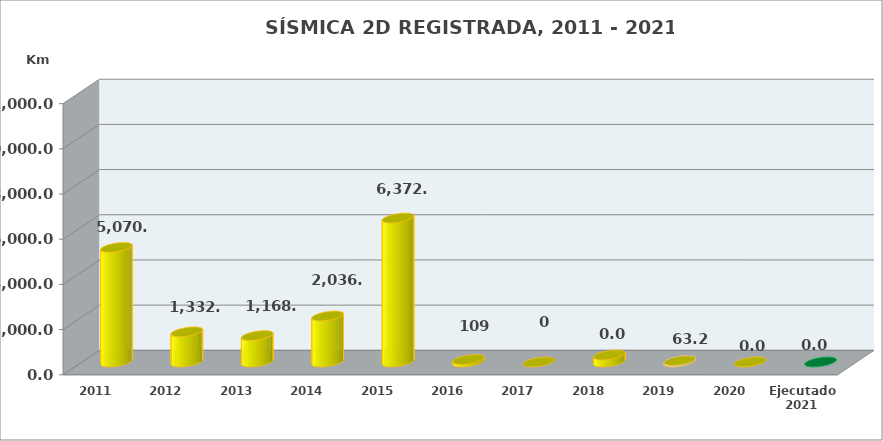
| Category | Series 0 |
|---|---|
| 2011 | 5070.18 |
| 2012 | 1332.85 |
| 2013 | 1168 |
| 2014 | 2036 |
| 2015 | 6372.61 |
| 2016 | 109 |
| 2017 | 0 |
| 2018 | 313.4 |
| 2019 | 63.22 |
| 2020 | 0 |
| Ejecutado 2021 | 0 |